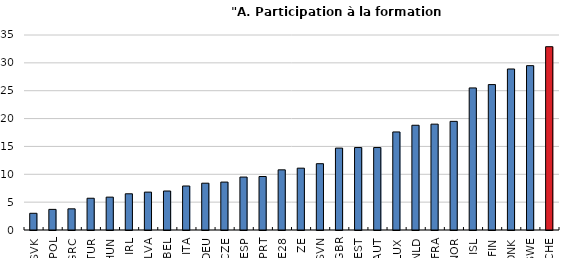
| Category | All ISCED 2011 levels  |
|---|---|
| SVK | 3 |
| POL | 3.7 |
| GRC | 3.8 |
| TUR | 5.7 |
| HUN | 5.9 |
| IRL | 6.5 |
| LVA | 6.8 |
| BEL | 7 |
| ITA | 7.9 |
| DEU | 8.4 |
| CZE | 8.6 |
| ESP | 9.5 |
| PRT | 9.6 |
| UE28 | 10.8 |
| ZE | 11.1 |
| SVN | 11.9 |
| GBR | 14.7 |
| EST | 14.8 |
| AUT | 14.8 |
| LUX | 17.6 |
| NLD | 18.8 |
| FRA | 19 |
| NOR | 19.5 |
| ISL | 25.5 |
| FIN | 26.1 |
| DNK | 28.9 |
| SWE | 29.5 |
| CHE | 32.9 |